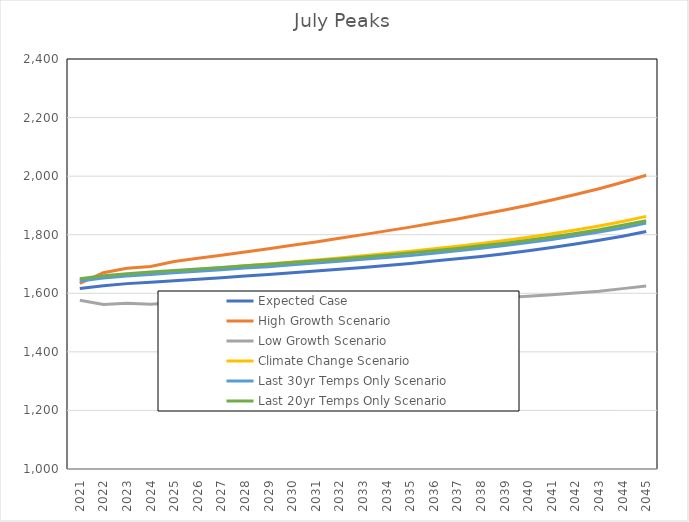
| Category | Expected Case | High Growth Scenario | Low Growth Scenario | Climate Change Scenario | Last 30yr Temps Only Scenario | Last 20yr Temps Only Scenario |
|---|---|---|---|---|---|---|
| 2021.0 | 1616 | 1634.142 | 1576.086 | 1644.604 | 1642 | 1650 |
| 2022.0 | 1626 | 1670.277 | 1561.596 | 1655.222 | 1652 | 1660 |
| 2023.0 | 1633 | 1685.175 | 1565.785 | 1663.571 | 1659 | 1667 |
| 2024.0 | 1638 | 1691.766 | 1562.279 | 1669.489 | 1664 | 1673 |
| 2025.0 | 1643 | 1708.453 | 1567.961 | 1675.412 | 1670 | 1678 |
| 2026.0 | 1648 | 1719.555 | 1568.425 | 1681.437 | 1675 | 1683 |
| 2027.0 | 1653 | 1729.727 | 1567.882 | 1687.577 | 1680 | 1688 |
| 2028.0 | 1659 | 1740.965 | 1568.335 | 1693.849 | 1686 | 1694 |
| 2029.0 | 1664 | 1752.276 | 1568.777 | 1700.273 | 1691 | 1699 |
| 2030.0 | 1670 | 1763.671 | 1569.196 | 1706.871 | 1697 | 1705 |
| 2031.0 | 1676 | 1775.145 | 1569.6 | 1713.67 | 1703 | 1711 |
| 2032.0 | 1682 | 1787.699 | 1570.987 | 1720.7 | 1709 | 1717 |
| 2033.0 | 1688 | 1800.343 | 1572.35 | 1727.999 | 1716 | 1724 |
| 2034.0 | 1695 | 1813.075 | 1573.687 | 1735.608 | 1722 | 1731 |
| 2035.0 | 1702 | 1825.905 | 1574.994 | 1743.579 | 1729 | 1738 |
| 2036.0 | 1710 | 1839.834 | 1577.268 | 1751.968 | 1737 | 1745 |
| 2037.0 | 1718 | 1853.881 | 1579.49 | 1760.845 | 1745 | 1753 |
| 2038.0 | 1726 | 1869.046 | 1582.664 | 1770.291 | 1754 | 1762 |
| 2039.0 | 1735 | 1884.343 | 1585.775 | 1780.398 | 1763 | 1771 |
| 2040.0 | 1745 | 1900.777 | 1589.82 | 1791.277 | 1773 | 1781 |
| 2041.0 | 1756 | 1918.389 | 1594.76 | 1803.058 | 1784 | 1792 |
| 2042.0 | 1768 | 1937.174 | 1600.601 | 1815.892 | 1796 | 1804 |
| 2043.0 | 1781 | 1957.163 | 1607.315 | 1829.955 | 1809 | 1817 |
| 2044.0 | 1795 | 1979.366 | 1615.894 | 1845.455 | 1823 | 1832 |
| 2045.0 | 1811 | 2002.867 | 1625.26 | 1862.636 | 1840 | 1848 |